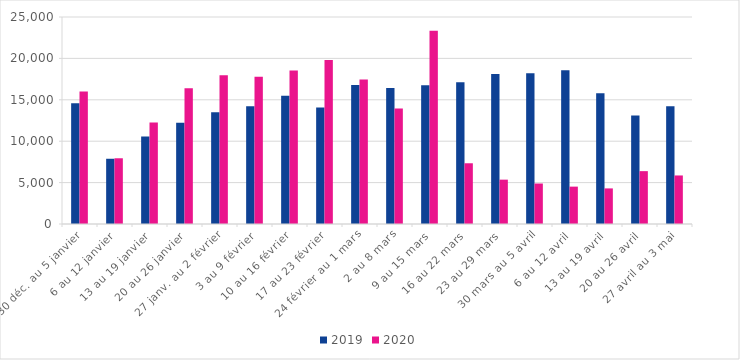
| Category | 2019 | 2020 |
|---|---|---|
| 30 déc. au 5 janvier | 14597 | 16013 |
| 6 au 12 janvier | 7879 | 7939 |
| 13 au 19 janvier | 10570 | 12246 |
| 20 au 26 janvier | 12222 | 16406 |
| 27 janv. au 2 février | 13510 | 17979 |
| 3 au 9 février | 14232 | 17775 |
| 10 au 16 février | 15499 | 18536 |
| 17 au 23 février | 14063 | 19809 |
| 24 février au 1 mars | 16783 | 17453 |
| 2 au 8 mars | 16432 | 13956 |
| 9 au 15 mars | 16765 | 23350 |
| 16 au 22 mars | 17107 | 7335 |
| 23 au 29 mars | 18126 | 5356 |
| 30 mars au 5 avril | 18204 | 4890 |
| 6 au 12 avril | 18560 | 4514 |
| 13 au 19 avril | 15788 | 4299 |
| 20 au 26 avril | 13099 | 6384 |
| 27 avril au 3 mai | 14207 | 5862 |